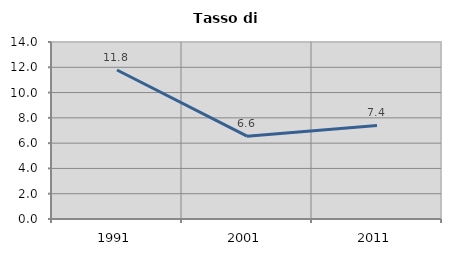
| Category | Tasso di disoccupazione   |
|---|---|
| 1991.0 | 11.786 |
| 2001.0 | 6.552 |
| 2011.0 | 7.403 |